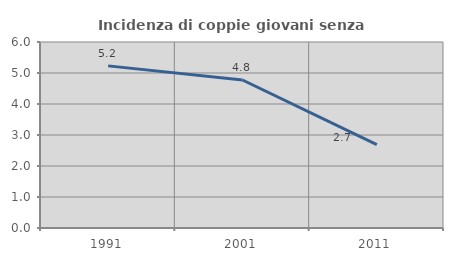
| Category | Incidenza di coppie giovani senza figli |
|---|---|
| 1991.0 | 5.23 |
| 2001.0 | 4.775 |
| 2011.0 | 2.688 |